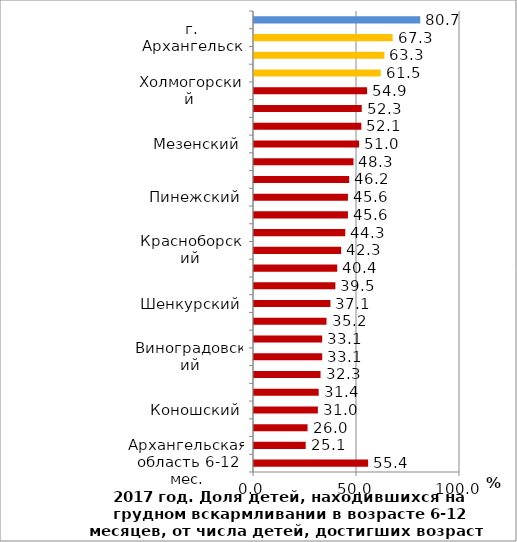
| Category | Series 0 |
|---|---|
| Архангельская область 6-12 мес. | 55.4 |
| Приморский | 25.1 |
| Няндомский | 26 |
| Коношский | 31 |
| Лешуконский | 31.4 |
| Ленский | 32.3 |
| Виноградовский | 33.1 |
| Плесецкий | 33.1 |
| (о. Соловки) | 35.2 |
| Шенкурский | 37.1 |
| Каргопольский | 39.5 |
| Верхнетоемский | 40.4 |
| Красноборский | 42.3 |
| Устьянский | 44.3 |
| Онежский | 45.6 |
| Пинежский | 45.6 |
| г. Коряжма | 46.2 |
| Вельский | 48.3 |
| Мезенский | 51 |
| г. Мирный | 52.1 |
| г. Новодвинск | 52.3 |
| Холмогорский | 54.9 |
| г. Котлас | 61.5 |
| г. Северодвинск | 63.3 |
| г. Архангельск | 67.3 |
| Вилегодский | 80.7 |